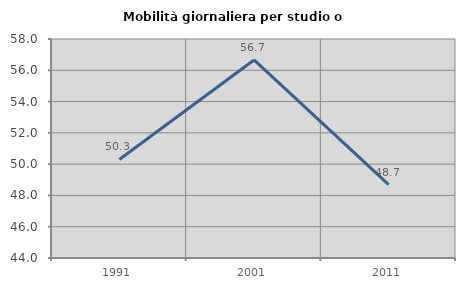
| Category | Mobilità giornaliera per studio o lavoro |
|---|---|
| 1991.0 | 50.298 |
| 2001.0 | 56.66 |
| 2011.0 | 48.694 |